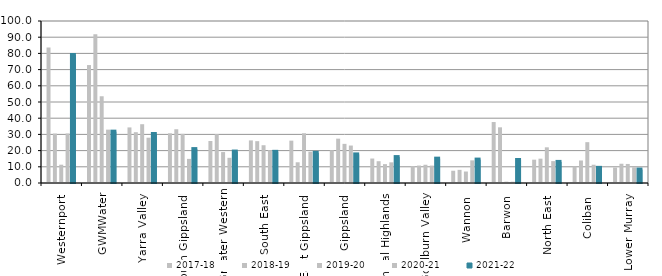
| Category | 2017-18 | 2018-19 | 2019-20 | 2020-21 | 2021-22 |
|---|---|---|---|---|---|
| Westernport  | 83.664 | 30.519 | 11.298 | 30.575 | 79.026 |
| GWMWater | 72.806 | 91.748 | 53.543 | 32.934 | 31.701 |
| Yarra Valley  | 34.312 | 31.364 | 36.289 | 27.964 | 30.231 |
| South Gippsland  | 30.664 | 33.18 | 30.324 | 14.888 | 20.929 |
| Greater Western | 25.932 | 30.163 | 19.091 | 15.552 | 19.408 |
| South East  | 26.285 | 25.83 | 23.322 | 20.282 | 19.238 |
| East Gippsland  | 26.143 | 12.796 | 30.707 | 19.309 | 18.607 |
| Gippsland  | 20.216 | 27.376 | 24.163 | 23.119 | 17.649 |
| Central Highlands  | 15.101 | 13.454 | 11.652 | 12.751 | 16 |
| Goulburn Valley  | 10.461 | 10.77 | 11.259 | 10.734 | 15.026 |
| Wannon  | 7.568 | 8.113 | 7.09 | 13.973 | 14.45 |
| Barwon  | 37.634 | 34.372 | 0.824 | 0.805 | 14.215 |
| North East  | 14.388 | 15.02 | 22.025 | 13.51 | 13.018 |
| Coliban  | 10.24 | 13.887 | 25.21 | 11.276 | 9.346 |
| Lower Murray  | 9.566 | 11.892 | 11.755 | 9.689 | 8.291 |